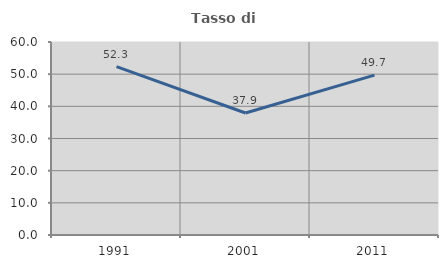
| Category | Tasso di occupazione   |
|---|---|
| 1991.0 | 52.318 |
| 2001.0 | 37.931 |
| 2011.0 | 49.708 |